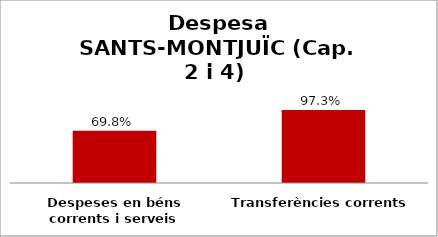
| Category | Series 0 |
|---|---|
| Despeses en béns corrents i serveis | 0.698 |
| Transferències corrents | 0.973 |